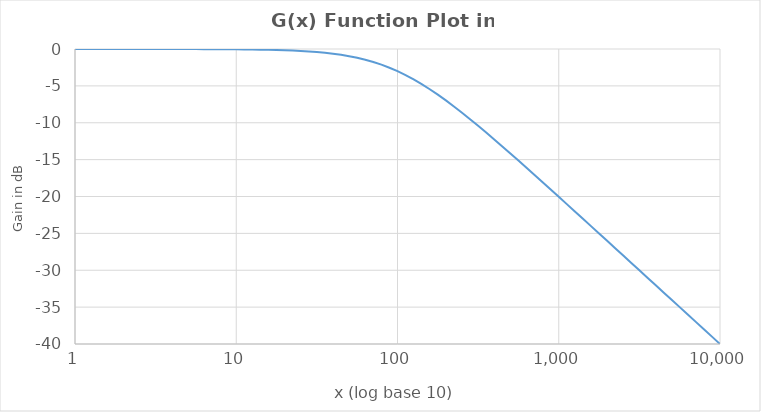
| Category | Series 0 |
|---|---|
| 1.0 | 0 |
| 1.1220184543019636 | -0.001 |
| 1.2589254117941673 | -0.001 |
| 1.4125375446227544 | -0.001 |
| 1.5848931924611136 | -0.001 |
| 1.778279410038923 | -0.001 |
| 1.9952623149688797 | -0.002 |
| 2.2387211385683394 | -0.002 |
| 2.5118864315095806 | -0.003 |
| 2.818382931264454 | -0.003 |
| 3.1622776601683795 | -0.004 |
| 3.5481338923357555 | -0.005 |
| 3.9810717055349727 | -0.007 |
| 4.466835921509632 | -0.009 |
| 5.011872336272723 | -0.011 |
| 5.623413251903492 | -0.014 |
| 6.309573444801934 | -0.017 |
| 7.0794578438413795 | -0.022 |
| 7.943282347242818 | -0.027 |
| 8.912509381337458 | -0.034 |
| 10.0 | -0.043 |
| 11.220184543019636 | -0.054 |
| 12.58925411794168 | -0.068 |
| 14.125375446227544 | -0.086 |
| 15.848931924611136 | -0.108 |
| 17.782794100389236 | -0.135 |
| 19.952623149688804 | -0.17 |
| 22.387211385683404 | -0.212 |
| 25.1188643150958 | -0.266 |
| 28.183829312644548 | -0.332 |
| 31.622776601683803 | -0.414 |
| 35.481338923357555 | -0.515 |
| 39.810717055349755 | -0.639 |
| 44.668359215096324 | -0.79 |
| 50.11872336272724 | -0.973 |
| 56.234132519034915 | -1.193 |
| 63.095734448019364 | -1.455 |
| 70.79457843841386 | -1.764 |
| 79.4328234724282 | -2.124 |
| 89.12509381337456 | -2.539 |
| 100.0 | -3.01 |
| 112.20184543019634 | -3.539 |
| 125.89254117941677 | -4.124 |
| 141.25375446227542 | -4.764 |
| 158.48931924611153 | -5.455 |
| 177.82794100389242 | -6.193 |
| 199.52623149688802 | -6.973 |
| 223.87211385683412 | -7.79 |
| 251.18864315095806 | -8.639 |
| 281.83829312644554 | -9.515 |
| 316.22776601683825 | -10.414 |
| 354.81338923357566 | -11.332 |
| 398.1071705534976 | -12.266 |
| 446.6835921509633 | -13.212 |
| 501.1872336272727 | -14.17 |
| 562.3413251903493 | -15.135 |
| 630.9573444801932 | -16.108 |
| 707.9457843841387 | -17.086 |
| 794.3282347242821 | -18.068 |
| 891.2509381337466 | -19.054 |
| 1000.0 | -20.043 |
| 1122.0184543019636 | -21.034 |
| 1258.925411794168 | -22.027 |
| 1412.5375446227545 | -23.022 |
| 1584.8931924611156 | -24.017 |
| 1778.2794100389244 | -25.014 |
| 1995.2623149688804 | -26.011 |
| 2238.7211385683418 | -27.009 |
| 2511.886431509581 | -28.007 |
| 2818.382931264456 | -29.005 |
| 3162.2776601683804 | -30.004 |
| 3548.133892335754 | -31.003 |
| 3981.071705534977 | -32.003 |
| 4466.835921509634 | -33.002 |
| 5011.872336272732 | -34.002 |
| 5623.413251903499 | -35.001 |
| 6309.573444801938 | -36.001 |
| 7079.457843841383 | -37.001 |
| 7943.282347242815 | -38.001 |
| 8912.509381337468 | -39.001 |
| 10000.0 | -40 |